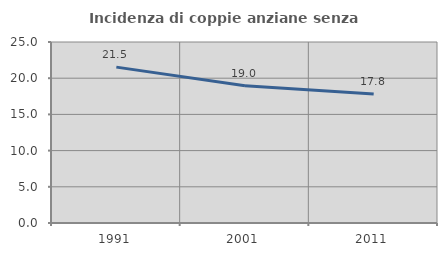
| Category | Incidenza di coppie anziane senza figli  |
|---|---|
| 1991.0 | 21.532 |
| 2001.0 | 18.96 |
| 2011.0 | 17.811 |